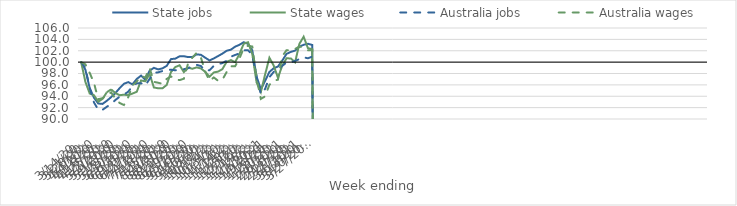
| Category | State jobs | State wages | Australia jobs | Australia wages |
|---|---|---|---|---|
| 14/03/2020 | 100 | 100 | 100 | 100 |
| 21/03/2020 | 98.653 | 96.512 | 98.97 | 99.607 |
| 28/03/2020 | 95.437 | 94.488 | 95.464 | 98.117 |
| 04/04/2020 | 93.747 | 94.176 | 92.906 | 96.324 |
| 11/04/2020 | 92.726 | 93.043 | 91.634 | 93.472 |
| 18/04/2020 | 92.656 | 93.539 | 91.618 | 93.672 |
| 25/04/2020 | 93.2 | 94.702 | 92.147 | 94.096 |
| 02/05/2020 | 93.832 | 95.213 | 92.646 | 94.684 |
| 09/05/2020 | 94.567 | 94.562 | 93.336 | 93.578 |
| 16/05/2020 | 95.425 | 94.18 | 93.928 | 92.809 |
| 23/05/2020 | 96.194 | 94.277 | 94.284 | 92.46 |
| 30/05/2020 | 96.48 | 94.185 | 94.792 | 93.812 |
| 06/06/2020 | 96.097 | 94.475 | 95.776 | 95.91 |
| 13/06/2020 | 97.036 | 94.785 | 96.277 | 96.583 |
| 20/06/2020 | 97.629 | 96.774 | 96.294 | 97.554 |
| 27/06/2020 | 96.906 | 96.631 | 95.892 | 97.289 |
| 04/07/2020 | 98.498 | 97.922 | 97.055 | 98.973 |
| 11/07/2020 | 98.996 | 95.541 | 98.106 | 96.533 |
| 18/07/2020 | 98.72 | 95.401 | 98.208 | 96.372 |
| 25/07/2020 | 98.903 | 95.388 | 98.434 | 96.181 |
| 01/08/2020 | 99.341 | 95.99 | 98.654 | 97.055 |
| 08/08/2020 | 100.531 | 98.248 | 98.656 | 97.48 |
| 15/08/2020 | 100.614 | 99.124 | 98.564 | 96.991 |
| 22/08/2020 | 101.016 | 99.449 | 98.619 | 96.84 |
| 29/08/2020 | 101.038 | 98.258 | 98.754 | 97.076 |
| 05/09/2020 | 100.884 | 99.026 | 98.928 | 99.803 |
| 12/09/2020 | 100.885 | 98.838 | 99.342 | 100.783 |
| 19/09/2020 | 101.371 | 99.078 | 99.517 | 101.637 |
| 26/09/2020 | 101.277 | 98.881 | 99.31 | 100.779 |
| 03/10/2020 | 100.784 | 98.294 | 98.488 | 98.325 |
| 10/10/2020 | 100.29 | 97.443 | 98.579 | 96.712 |
| 17/10/2020 | 100.647 | 98.183 | 99.343 | 97.299 |
| 24/10/2020 | 101.064 | 98.333 | 99.616 | 96.732 |
| 31/10/2020 | 101.491 | 98.756 | 99.832 | 96.893 |
| 07/11/2020 | 101.998 | 100.046 | 100.231 | 98.252 |
| 14/11/2020 | 102.192 | 100.356 | 100.956 | 99.261 |
| 21/11/2020 | 102.724 | 99.996 | 101.258 | 99.291 |
| 28/11/2020 | 103.047 | 101.447 | 101.546 | 100.638 |
| 05/12/2020 | 103.499 | 103.231 | 102.06 | 102.456 |
| 12/12/2020 | 103.227 | 103.5 | 102.096 | 102.885 |
| 19/12/2020 | 102.063 | 101.416 | 101.265 | 102.743 |
| 26/12/2020 | 97.442 | 96.446 | 97.433 | 97.212 |
| 02/01/2021 | 95.23 | 94.739 | 94.376 | 93.531 |
| 09/01/2021 | 96.724 | 97.844 | 95.285 | 93.978 |
| 16/01/2021 | 98.268 | 100.768 | 97.349 | 96.028 |
| 23/01/2021 | 98.923 | 99.406 | 98.277 | 96.664 |
| 30/01/2021 | 99.221 | 97.242 | 98.681 | 96.928 |
| 06/02/2021 | 100.269 | 99.396 | 99.348 | 101.023 |
| 13/02/2021 | 101.447 | 100.666 | 99.928 | 102.099 |
| 20/02/2021 | 101.794 | 100.653 | 99.969 | 102.073 |
| 27/02/2021 | 102.028 | 99.974 | 100.21 | 102.312 |
| 06/03/2021 | 102.694 | 103.203 | 100.53 | 102.759 |
| 13/03/2021 | 103.051 | 104.469 | 100.859 | 102.584 |
| 20/03/2021 | 103.226 | 102.459 | 100.674 | 102.081 |
| 27/03/2021 | 103.022 | 102.284 | 100.974 | 102.126 |